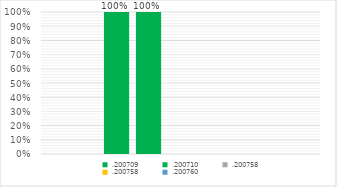
| Category | .200709 | .200710 | .200758 | .200760 |
|---|---|---|---|---|
| 0 | 1 | 1 | 0 | 0 |